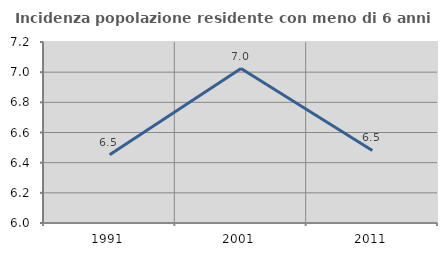
| Category | Incidenza popolazione residente con meno di 6 anni |
|---|---|
| 1991.0 | 6.453 |
| 2001.0 | 7.024 |
| 2011.0 | 6.481 |